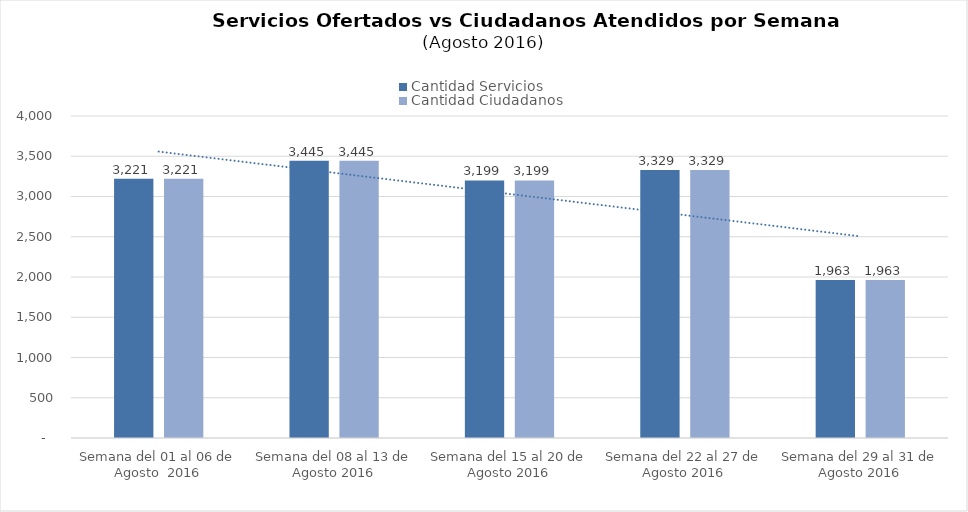
| Category | Cantidad Servicios | Cantidad Ciudadanos |
|---|---|---|
| Semana del 01 al 06 de Agosto  2016 | 3221 | 3221 |
| Semana del 08 al 13 de Agosto 2016 | 3445 | 3445 |
| Semana del 15 al 20 de Agosto 2016 | 3199 | 3199 |
| Semana del 22 al 27 de Agosto 2016 | 3329 | 3329 |
| Semana del 29 al 31 de Agosto 2016 | 1963 | 1963 |